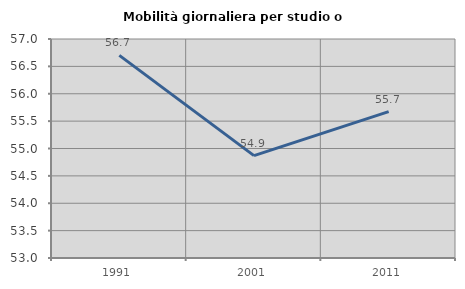
| Category | Mobilità giornaliera per studio o lavoro |
|---|---|
| 1991.0 | 56.701 |
| 2001.0 | 54.87 |
| 2011.0 | 55.673 |